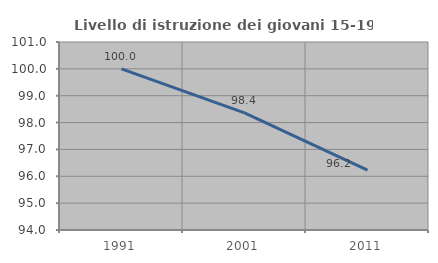
| Category | Livello di istruzione dei giovani 15-19 anni |
|---|---|
| 1991.0 | 100 |
| 2001.0 | 98.361 |
| 2011.0 | 96.226 |